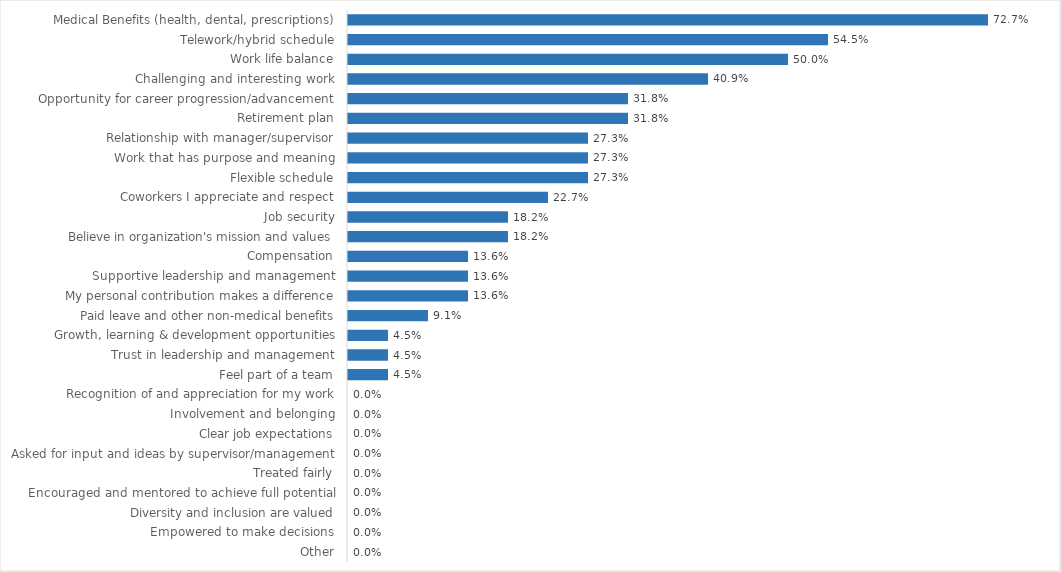
| Category | Green Mountain Care Board |
|---|---|
| Medical Benefits (health, dental, prescriptions) | 0.727 |
| Telework/hybrid schedule | 0.545 |
| Work life balance | 0.5 |
| Challenging and interesting work | 0.409 |
| Opportunity for career progression/advancement | 0.318 |
| Retirement plan | 0.318 |
| Relationship with manager/supervisor | 0.273 |
| Work that has purpose and meaning | 0.273 |
| Flexible schedule | 0.273 |
| Coworkers I appreciate and respect | 0.227 |
| Job security | 0.182 |
| Believe in organization's mission and values | 0.182 |
| Compensation | 0.136 |
| Supportive leadership and management | 0.136 |
| My personal contribution makes a difference | 0.136 |
| Paid leave and other non-medical benefits | 0.091 |
| Growth, learning & development opportunities | 0.045 |
| Trust in leadership and management | 0.045 |
| Feel part of a team | 0.045 |
| Recognition of and appreciation for my work | 0 |
| Involvement and belonging | 0 |
| Clear job expectations | 0 |
| Asked for input and ideas by supervisor/management | 0 |
| Treated fairly | 0 |
| Encouraged and mentored to achieve full potential | 0 |
| Diversity and inclusion are valued | 0 |
| Empowered to make decisions | 0 |
| Other | 0 |